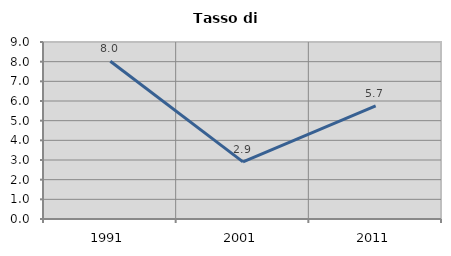
| Category | Tasso di disoccupazione   |
|---|---|
| 1991.0 | 8.024 |
| 2001.0 | 2.902 |
| 2011.0 | 5.749 |